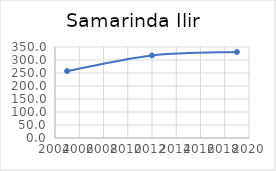
| Category | Series 0 |
|---|---|
| 2005.0 | 257.328 |
| 2012.0 | 317.753 |
| 2019.0 | 330.866 |